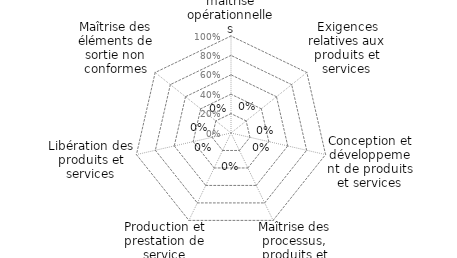
| Category | Art 8 |
|---|---|
| 0 | 0 |
| 1 | 0 |
| 2 | 0 |
| 3 | 0 |
| 4 | 0 |
| 5 | 0 |
| 6 | 0 |